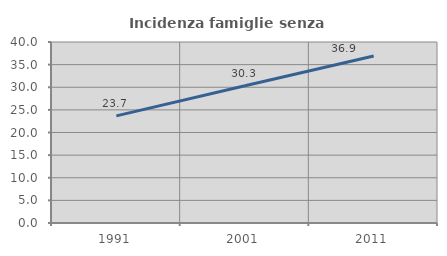
| Category | Incidenza famiglie senza nuclei |
|---|---|
| 1991.0 | 23.676 |
| 2001.0 | 30.32 |
| 2011.0 | 36.913 |